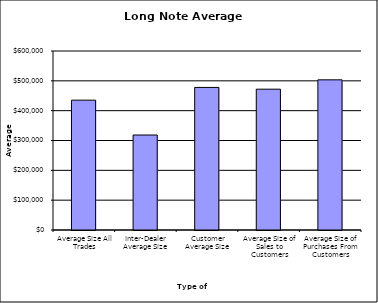
| Category | Security Type |
|---|---|
| Average Size All Trades | 435218.099 |
| Inter-Dealer Average Size | 318388.545 |
| Customer Average Size | 477889.456 |
| Average Size of Sales to Customers | 472040.028 |
| Average Size of Purchases From Customers | 503339.023 |